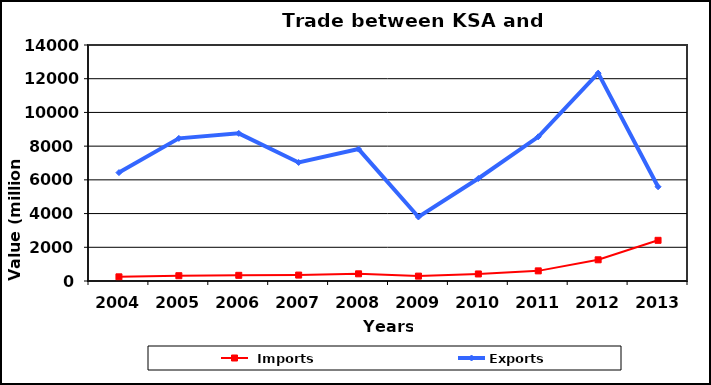
| Category |  Imports | Exports |
|---|---|---|
| 2004.0 | 247 | 6430 |
| 2005.0 | 314 | 8461 |
| 2006.0 | 337 | 8758 |
| 2007.0 | 351 | 7032 |
| 2008.0 | 426 | 7827 |
| 2009.0 | 290 | 3799 |
| 2010.0 | 418 | 6082 |
| 2011.0 | 601 | 8555 |
| 2012.0 | 1258 | 12331 |
| 2013.0 | 2413 | 5591 |